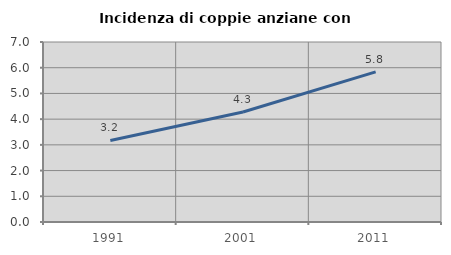
| Category | Incidenza di coppie anziane con figli |
|---|---|
| 1991.0 | 3.171 |
| 2001.0 | 4.279 |
| 2011.0 | 5.84 |